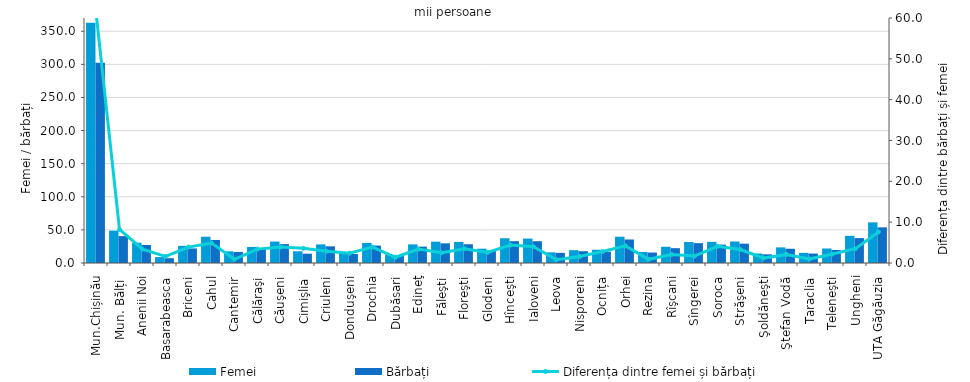
| Category | Femei | Bărbați  |
|---|---|---|
| Mun.Chișinău | 362.9 | 302.6 |
| Mun. Bălți  | 48.8 | 40.6 |
| Anenii Noi | 30.6 | 27.2 |
| Basarabeasca | 8.9 | 7.3 |
| Briceni | 25.9 | 22 |
| Cahul | 39.7 | 34.8 |
| Cantemir | 17.6 | 16.7 |
| Călăraşi | 24.3 | 20.9 |
| Căuşeni | 32.4 | 28.5 |
| Cimişlia | 17.7 | 14.1 |
| Criuleni | 28.1 | 25.2 |
| Donduşeni | 16 | 13.6 |
| Drochia | 30.3 | 26.4 |
| Dubăsari | 12.4 | 11 |
|  Edineţ | 28.1 | 24.7 |
| Făleşti | 32.2 | 29.7 |
| Floreşti | 31.8 | 28.3 |
| Glodeni | 21.6 | 19 |
| Hînceşti | 37.4 | 33 |
| Ialoveni | 36.9 | 32.9 |
| Leova | 16.1 | 15.3 |
| Nisporeni | 19.4 | 17.8 |
| Ocnița | 20 | 17.2 |
| Orhei | 39.7 | 35.5 |
| Rezina | 16.7 | 15.8 |
| Rîşcani | 24.5 | 22.4 |
| Sîngerei | 31.7 | 30 |
| Soroca | 31.9 | 27.8 |
| Străşeni | 32.5 | 29.2 |
| Şoldăneşti | 14.3 | 13.1 |
| Ştefan Vodă | 23.6 | 21.5 |
| Taraclia | 15.3 | 14.3 |
| Teleneşti | 21.9 | 19.7 |
| Ungheni | 41.1 | 37.6 |
| UTA Găgăuzia | 61.4 | 53.8 |